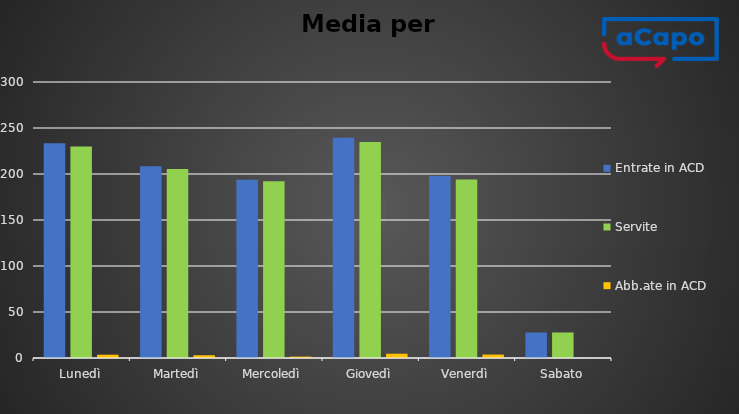
| Category | Entrate in ACD | Servite | Abb.ate in ACD |
|---|---|---|---|
| Lunedì | 233.4 | 229.8 | 3.6 |
| Martedì | 208.5 | 205.5 | 3 |
| Mercoledì | 193.75 | 192.25 | 1.5 |
| Giovedì | 239.333 | 234.667 | 4.667 |
| Venerdì | 197.75 | 194 | 3.75 |
| Sabato | 27.75 | 27.75 | 0 |